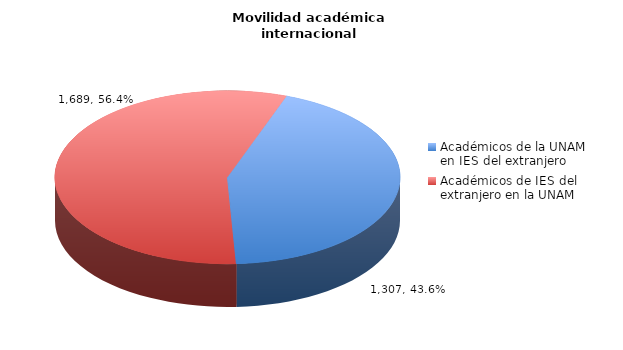
| Category | Series 0 |
|---|---|
| Académicos de la UNAM en IES del extranjero | 1307 |
| Académicos de IES del extranjero en la UNAM | 1689 |